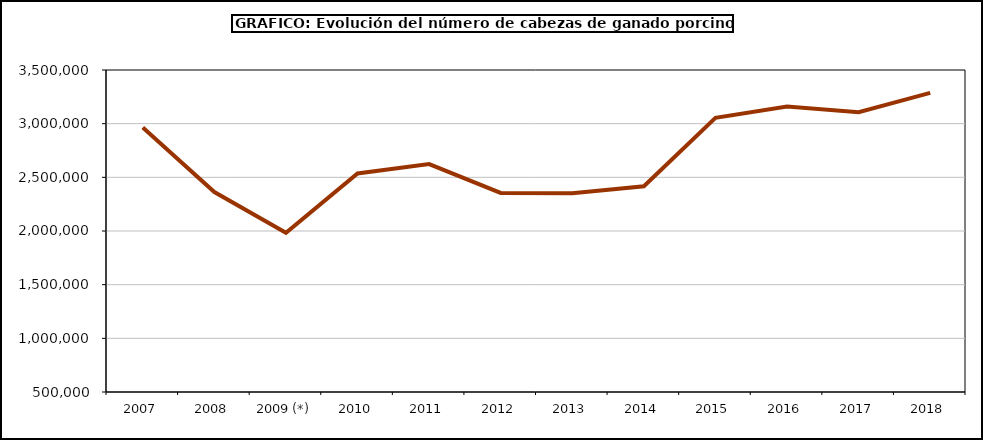
| Category | Total porcino |
|---|---|
| 2007 | 2963922.516 |
| 2008 | 2362406.6 |
| 2009 (*) | 1983218.02 |
| 2010 | 2536564 |
| 2011 | 2624006 |
| 2012 | 2354690 |
| 2013 | 2351566 |
| 2014 | 2416557.46 |
| 2015 | 3053965.076 |
| 2016 | 3158719.951 |
| 2017 | 3106767.464 |
| 2018 | 3287091.287 |